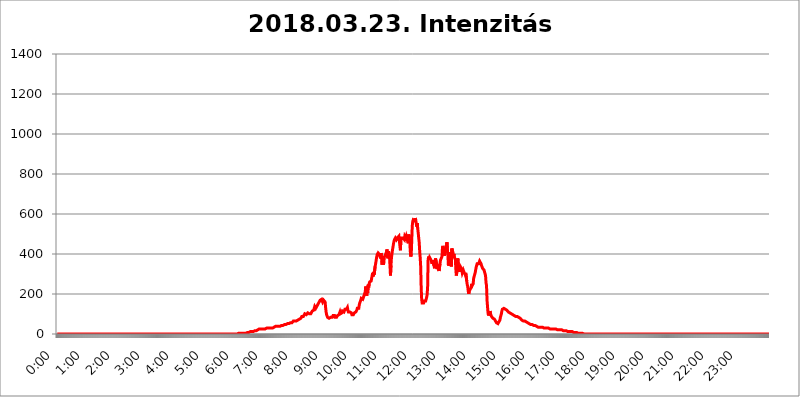
| Category | 2018.03.23. Intenzitás [W/m^2] |
|---|---|
| 0.0 | 0 |
| 0.0006944444444444445 | 0 |
| 0.001388888888888889 | 0 |
| 0.0020833333333333333 | 0 |
| 0.002777777777777778 | 0 |
| 0.003472222222222222 | 0 |
| 0.004166666666666667 | 0 |
| 0.004861111111111111 | 0 |
| 0.005555555555555556 | 0 |
| 0.0062499999999999995 | 0 |
| 0.006944444444444444 | 0 |
| 0.007638888888888889 | 0 |
| 0.008333333333333333 | 0 |
| 0.009027777777777779 | 0 |
| 0.009722222222222222 | 0 |
| 0.010416666666666666 | 0 |
| 0.011111111111111112 | 0 |
| 0.011805555555555555 | 0 |
| 0.012499999999999999 | 0 |
| 0.013194444444444444 | 0 |
| 0.013888888888888888 | 0 |
| 0.014583333333333332 | 0 |
| 0.015277777777777777 | 0 |
| 0.015972222222222224 | 0 |
| 0.016666666666666666 | 0 |
| 0.017361111111111112 | 0 |
| 0.018055555555555557 | 0 |
| 0.01875 | 0 |
| 0.019444444444444445 | 0 |
| 0.02013888888888889 | 0 |
| 0.020833333333333332 | 0 |
| 0.02152777777777778 | 0 |
| 0.022222222222222223 | 0 |
| 0.02291666666666667 | 0 |
| 0.02361111111111111 | 0 |
| 0.024305555555555556 | 0 |
| 0.024999999999999998 | 0 |
| 0.025694444444444447 | 0 |
| 0.02638888888888889 | 0 |
| 0.027083333333333334 | 0 |
| 0.027777777777777776 | 0 |
| 0.02847222222222222 | 0 |
| 0.029166666666666664 | 0 |
| 0.029861111111111113 | 0 |
| 0.030555555555555555 | 0 |
| 0.03125 | 0 |
| 0.03194444444444445 | 0 |
| 0.03263888888888889 | 0 |
| 0.03333333333333333 | 0 |
| 0.034027777777777775 | 0 |
| 0.034722222222222224 | 0 |
| 0.035416666666666666 | 0 |
| 0.036111111111111115 | 0 |
| 0.03680555555555556 | 0 |
| 0.0375 | 0 |
| 0.03819444444444444 | 0 |
| 0.03888888888888889 | 0 |
| 0.03958333333333333 | 0 |
| 0.04027777777777778 | 0 |
| 0.04097222222222222 | 0 |
| 0.041666666666666664 | 0 |
| 0.042361111111111106 | 0 |
| 0.04305555555555556 | 0 |
| 0.043750000000000004 | 0 |
| 0.044444444444444446 | 0 |
| 0.04513888888888889 | 0 |
| 0.04583333333333334 | 0 |
| 0.04652777777777778 | 0 |
| 0.04722222222222222 | 0 |
| 0.04791666666666666 | 0 |
| 0.04861111111111111 | 0 |
| 0.049305555555555554 | 0 |
| 0.049999999999999996 | 0 |
| 0.05069444444444445 | 0 |
| 0.051388888888888894 | 0 |
| 0.052083333333333336 | 0 |
| 0.05277777777777778 | 0 |
| 0.05347222222222222 | 0 |
| 0.05416666666666667 | 0 |
| 0.05486111111111111 | 0 |
| 0.05555555555555555 | 0 |
| 0.05625 | 0 |
| 0.05694444444444444 | 0 |
| 0.057638888888888885 | 0 |
| 0.05833333333333333 | 0 |
| 0.05902777777777778 | 0 |
| 0.059722222222222225 | 0 |
| 0.06041666666666667 | 0 |
| 0.061111111111111116 | 0 |
| 0.06180555555555556 | 0 |
| 0.0625 | 0 |
| 0.06319444444444444 | 0 |
| 0.06388888888888888 | 0 |
| 0.06458333333333334 | 0 |
| 0.06527777777777778 | 0 |
| 0.06597222222222222 | 0 |
| 0.06666666666666667 | 0 |
| 0.06736111111111111 | 0 |
| 0.06805555555555555 | 0 |
| 0.06874999999999999 | 0 |
| 0.06944444444444443 | 0 |
| 0.07013888888888889 | 0 |
| 0.07083333333333333 | 0 |
| 0.07152777777777779 | 0 |
| 0.07222222222222223 | 0 |
| 0.07291666666666667 | 0 |
| 0.07361111111111111 | 0 |
| 0.07430555555555556 | 0 |
| 0.075 | 0 |
| 0.07569444444444444 | 0 |
| 0.0763888888888889 | 0 |
| 0.07708333333333334 | 0 |
| 0.07777777777777778 | 0 |
| 0.07847222222222222 | 0 |
| 0.07916666666666666 | 0 |
| 0.0798611111111111 | 0 |
| 0.08055555555555556 | 0 |
| 0.08125 | 0 |
| 0.08194444444444444 | 0 |
| 0.08263888888888889 | 0 |
| 0.08333333333333333 | 0 |
| 0.08402777777777777 | 0 |
| 0.08472222222222221 | 0 |
| 0.08541666666666665 | 0 |
| 0.08611111111111112 | 0 |
| 0.08680555555555557 | 0 |
| 0.08750000000000001 | 0 |
| 0.08819444444444445 | 0 |
| 0.08888888888888889 | 0 |
| 0.08958333333333333 | 0 |
| 0.09027777777777778 | 0 |
| 0.09097222222222222 | 0 |
| 0.09166666666666667 | 0 |
| 0.09236111111111112 | 0 |
| 0.09305555555555556 | 0 |
| 0.09375 | 0 |
| 0.09444444444444444 | 0 |
| 0.09513888888888888 | 0 |
| 0.09583333333333333 | 0 |
| 0.09652777777777777 | 0 |
| 0.09722222222222222 | 0 |
| 0.09791666666666667 | 0 |
| 0.09861111111111111 | 0 |
| 0.09930555555555555 | 0 |
| 0.09999999999999999 | 0 |
| 0.10069444444444443 | 0 |
| 0.1013888888888889 | 0 |
| 0.10208333333333335 | 0 |
| 0.10277777777777779 | 0 |
| 0.10347222222222223 | 0 |
| 0.10416666666666667 | 0 |
| 0.10486111111111111 | 0 |
| 0.10555555555555556 | 0 |
| 0.10625 | 0 |
| 0.10694444444444444 | 0 |
| 0.1076388888888889 | 0 |
| 0.10833333333333334 | 0 |
| 0.10902777777777778 | 0 |
| 0.10972222222222222 | 0 |
| 0.1111111111111111 | 0 |
| 0.11180555555555556 | 0 |
| 0.11180555555555556 | 0 |
| 0.1125 | 0 |
| 0.11319444444444444 | 0 |
| 0.11388888888888889 | 0 |
| 0.11458333333333333 | 0 |
| 0.11527777777777777 | 0 |
| 0.11597222222222221 | 0 |
| 0.11666666666666665 | 0 |
| 0.1173611111111111 | 0 |
| 0.11805555555555557 | 0 |
| 0.11944444444444445 | 0 |
| 0.12013888888888889 | 0 |
| 0.12083333333333333 | 0 |
| 0.12152777777777778 | 0 |
| 0.12222222222222223 | 0 |
| 0.12291666666666667 | 0 |
| 0.12291666666666667 | 0 |
| 0.12361111111111112 | 0 |
| 0.12430555555555556 | 0 |
| 0.125 | 0 |
| 0.12569444444444444 | 0 |
| 0.12638888888888888 | 0 |
| 0.12708333333333333 | 0 |
| 0.16875 | 0 |
| 0.12847222222222224 | 0 |
| 0.12916666666666668 | 0 |
| 0.12986111111111112 | 0 |
| 0.13055555555555556 | 0 |
| 0.13125 | 0 |
| 0.13194444444444445 | 0 |
| 0.1326388888888889 | 0 |
| 0.13333333333333333 | 0 |
| 0.13402777777777777 | 0 |
| 0.13402777777777777 | 0 |
| 0.13472222222222222 | 0 |
| 0.13541666666666666 | 0 |
| 0.1361111111111111 | 0 |
| 0.13749999999999998 | 0 |
| 0.13819444444444443 | 0 |
| 0.1388888888888889 | 0 |
| 0.13958333333333334 | 0 |
| 0.14027777777777778 | 0 |
| 0.14097222222222222 | 0 |
| 0.14166666666666666 | 0 |
| 0.1423611111111111 | 0 |
| 0.14305555555555557 | 0 |
| 0.14375000000000002 | 0 |
| 0.14444444444444446 | 0 |
| 0.1451388888888889 | 0 |
| 0.1451388888888889 | 0 |
| 0.14652777777777778 | 0 |
| 0.14722222222222223 | 0 |
| 0.14791666666666667 | 0 |
| 0.1486111111111111 | 0 |
| 0.14930555555555555 | 0 |
| 0.15 | 0 |
| 0.15069444444444444 | 0 |
| 0.15138888888888888 | 0 |
| 0.15208333333333332 | 0 |
| 0.15277777777777776 | 0 |
| 0.15347222222222223 | 0 |
| 0.15416666666666667 | 0 |
| 0.15486111111111112 | 0 |
| 0.15555555555555556 | 0 |
| 0.15625 | 0 |
| 0.15694444444444444 | 0 |
| 0.15763888888888888 | 0 |
| 0.15833333333333333 | 0 |
| 0.15902777777777777 | 0 |
| 0.15972222222222224 | 0 |
| 0.16041666666666668 | 0 |
| 0.16111111111111112 | 0 |
| 0.16180555555555556 | 0 |
| 0.1625 | 0 |
| 0.16319444444444445 | 0 |
| 0.1638888888888889 | 0 |
| 0.16458333333333333 | 0 |
| 0.16527777777777777 | 0 |
| 0.16597222222222222 | 0 |
| 0.16666666666666666 | 0 |
| 0.1673611111111111 | 0 |
| 0.16805555555555554 | 0 |
| 0.16874999999999998 | 0 |
| 0.16944444444444443 | 0 |
| 0.17013888888888887 | 0 |
| 0.1708333333333333 | 0 |
| 0.17152777777777775 | 0 |
| 0.17222222222222225 | 0 |
| 0.1729166666666667 | 0 |
| 0.17361111111111113 | 0 |
| 0.17430555555555557 | 0 |
| 0.17500000000000002 | 0 |
| 0.17569444444444446 | 0 |
| 0.1763888888888889 | 0 |
| 0.17708333333333334 | 0 |
| 0.17777777777777778 | 0 |
| 0.17847222222222223 | 0 |
| 0.17916666666666667 | 0 |
| 0.1798611111111111 | 0 |
| 0.18055555555555555 | 0 |
| 0.18125 | 0 |
| 0.18194444444444444 | 0 |
| 0.1826388888888889 | 0 |
| 0.18333333333333335 | 0 |
| 0.1840277777777778 | 0 |
| 0.18472222222222223 | 0 |
| 0.18541666666666667 | 0 |
| 0.18611111111111112 | 0 |
| 0.18680555555555556 | 0 |
| 0.1875 | 0 |
| 0.18819444444444444 | 0 |
| 0.18888888888888888 | 0 |
| 0.18958333333333333 | 0 |
| 0.19027777777777777 | 0 |
| 0.1909722222222222 | 0 |
| 0.19166666666666665 | 0 |
| 0.19236111111111112 | 0 |
| 0.19305555555555554 | 0 |
| 0.19375 | 0 |
| 0.19444444444444445 | 0 |
| 0.1951388888888889 | 0 |
| 0.19583333333333333 | 0 |
| 0.19652777777777777 | 0 |
| 0.19722222222222222 | 0 |
| 0.19791666666666666 | 0 |
| 0.1986111111111111 | 0 |
| 0.19930555555555554 | 0 |
| 0.19999999999999998 | 0 |
| 0.20069444444444443 | 0 |
| 0.20138888888888887 | 0 |
| 0.2020833333333333 | 0 |
| 0.2027777777777778 | 0 |
| 0.2034722222222222 | 0 |
| 0.2041666666666667 | 0 |
| 0.20486111111111113 | 0 |
| 0.20555555555555557 | 0 |
| 0.20625000000000002 | 0 |
| 0.20694444444444446 | 0 |
| 0.2076388888888889 | 0 |
| 0.20833333333333334 | 0 |
| 0.20902777777777778 | 0 |
| 0.20972222222222223 | 0 |
| 0.21041666666666667 | 0 |
| 0.2111111111111111 | 0 |
| 0.21180555555555555 | 0 |
| 0.2125 | 0 |
| 0.21319444444444444 | 0 |
| 0.2138888888888889 | 0 |
| 0.21458333333333335 | 0 |
| 0.2152777777777778 | 0 |
| 0.21597222222222223 | 0 |
| 0.21666666666666667 | 0 |
| 0.21736111111111112 | 0 |
| 0.21805555555555556 | 0 |
| 0.21875 | 0 |
| 0.21944444444444444 | 0 |
| 0.22013888888888888 | 0 |
| 0.22083333333333333 | 0 |
| 0.22152777777777777 | 0 |
| 0.2222222222222222 | 0 |
| 0.22291666666666665 | 0 |
| 0.2236111111111111 | 0 |
| 0.22430555555555556 | 0 |
| 0.225 | 0 |
| 0.22569444444444445 | 0 |
| 0.2263888888888889 | 0 |
| 0.22708333333333333 | 0 |
| 0.22777777777777777 | 0 |
| 0.22847222222222222 | 0 |
| 0.22916666666666666 | 0 |
| 0.2298611111111111 | 0 |
| 0.23055555555555554 | 0 |
| 0.23124999999999998 | 0 |
| 0.23194444444444443 | 0 |
| 0.23263888888888887 | 0 |
| 0.2333333333333333 | 0 |
| 0.2340277777777778 | 0 |
| 0.2347222222222222 | 0 |
| 0.2354166666666667 | 0 |
| 0.23611111111111113 | 0 |
| 0.23680555555555557 | 0 |
| 0.23750000000000002 | 0 |
| 0.23819444444444446 | 0 |
| 0.2388888888888889 | 0 |
| 0.23958333333333334 | 0 |
| 0.24027777777777778 | 0 |
| 0.24097222222222223 | 0 |
| 0.24166666666666667 | 0 |
| 0.2423611111111111 | 0 |
| 0.24305555555555555 | 0 |
| 0.24375 | 0 |
| 0.24444444444444446 | 0 |
| 0.24513888888888888 | 0 |
| 0.24583333333333335 | 0 |
| 0.2465277777777778 | 0 |
| 0.24722222222222223 | 0 |
| 0.24791666666666667 | 0 |
| 0.24861111111111112 | 0 |
| 0.24930555555555556 | 0 |
| 0.25 | 0 |
| 0.25069444444444444 | 0 |
| 0.2513888888888889 | 0 |
| 0.2520833333333333 | 0 |
| 0.25277777777777777 | 0 |
| 0.2534722222222222 | 3.525 |
| 0.25416666666666665 | 3.525 |
| 0.2548611111111111 | 3.525 |
| 0.2555555555555556 | 3.525 |
| 0.25625000000000003 | 3.525 |
| 0.2569444444444445 | 3.525 |
| 0.2576388888888889 | 3.525 |
| 0.25833333333333336 | 3.525 |
| 0.2590277777777778 | 3.525 |
| 0.25972222222222224 | 3.525 |
| 0.2604166666666667 | 3.525 |
| 0.2611111111111111 | 3.525 |
| 0.26180555555555557 | 3.525 |
| 0.2625 | 3.525 |
| 0.26319444444444445 | 3.525 |
| 0.2638888888888889 | 3.525 |
| 0.26458333333333334 | 3.525 |
| 0.2652777777777778 | 3.525 |
| 0.2659722222222222 | 3.525 |
| 0.26666666666666666 | 7.887 |
| 0.2673611111111111 | 7.887 |
| 0.26805555555555555 | 7.887 |
| 0.26875 | 7.887 |
| 0.26944444444444443 | 7.887 |
| 0.2701388888888889 | 7.887 |
| 0.2708333333333333 | 12.257 |
| 0.27152777777777776 | 7.887 |
| 0.2722222222222222 | 12.257 |
| 0.27291666666666664 | 12.257 |
| 0.2736111111111111 | 12.257 |
| 0.2743055555555555 | 12.257 |
| 0.27499999999999997 | 12.257 |
| 0.27569444444444446 | 12.257 |
| 0.27638888888888885 | 12.257 |
| 0.27708333333333335 | 16.636 |
| 0.2777777777777778 | 16.636 |
| 0.27847222222222223 | 16.636 |
| 0.2791666666666667 | 16.636 |
| 0.2798611111111111 | 16.636 |
| 0.28055555555555556 | 21.024 |
| 0.28125 | 21.024 |
| 0.28194444444444444 | 21.024 |
| 0.2826388888888889 | 21.024 |
| 0.2833333333333333 | 25.419 |
| 0.28402777777777777 | 25.419 |
| 0.2847222222222222 | 25.419 |
| 0.28541666666666665 | 25.419 |
| 0.28611111111111115 | 25.419 |
| 0.28680555555555554 | 25.419 |
| 0.28750000000000003 | 25.419 |
| 0.2881944444444445 | 25.419 |
| 0.2888888888888889 | 25.419 |
| 0.28958333333333336 | 25.419 |
| 0.2902777777777778 | 25.419 |
| 0.29097222222222224 | 25.419 |
| 0.2916666666666667 | 25.419 |
| 0.2923611111111111 | 25.419 |
| 0.29305555555555557 | 29.823 |
| 0.29375 | 29.823 |
| 0.29444444444444445 | 29.823 |
| 0.2951388888888889 | 29.823 |
| 0.29583333333333334 | 29.823 |
| 0.2965277777777778 | 29.823 |
| 0.2972222222222222 | 29.823 |
| 0.29791666666666666 | 29.823 |
| 0.2986111111111111 | 29.823 |
| 0.29930555555555555 | 29.823 |
| 0.3 | 29.823 |
| 0.30069444444444443 | 29.823 |
| 0.3013888888888889 | 29.823 |
| 0.3020833333333333 | 29.823 |
| 0.30277777777777776 | 29.823 |
| 0.3034722222222222 | 34.234 |
| 0.30416666666666664 | 34.234 |
| 0.3048611111111111 | 34.234 |
| 0.3055555555555555 | 34.234 |
| 0.30624999999999997 | 38.653 |
| 0.3069444444444444 | 38.653 |
| 0.3076388888888889 | 38.653 |
| 0.30833333333333335 | 38.653 |
| 0.3090277777777778 | 38.653 |
| 0.30972222222222223 | 38.653 |
| 0.3104166666666667 | 38.653 |
| 0.3111111111111111 | 38.653 |
| 0.31180555555555556 | 38.653 |
| 0.3125 | 38.653 |
| 0.31319444444444444 | 38.653 |
| 0.3138888888888889 | 43.079 |
| 0.3145833333333333 | 43.079 |
| 0.31527777777777777 | 43.079 |
| 0.3159722222222222 | 43.079 |
| 0.31666666666666665 | 43.079 |
| 0.31736111111111115 | 43.079 |
| 0.31805555555555554 | 47.511 |
| 0.31875000000000003 | 47.511 |
| 0.3194444444444445 | 47.511 |
| 0.3201388888888889 | 47.511 |
| 0.32083333333333336 | 47.511 |
| 0.3215277777777778 | 47.511 |
| 0.32222222222222224 | 51.951 |
| 0.3229166666666667 | 51.951 |
| 0.3236111111111111 | 51.951 |
| 0.32430555555555557 | 51.951 |
| 0.325 | 51.951 |
| 0.32569444444444445 | 51.951 |
| 0.3263888888888889 | 56.398 |
| 0.32708333333333334 | 56.398 |
| 0.3277777777777778 | 56.398 |
| 0.3284722222222222 | 56.398 |
| 0.32916666666666666 | 56.398 |
| 0.3298611111111111 | 60.85 |
| 0.33055555555555555 | 60.85 |
| 0.33125 | 65.31 |
| 0.33194444444444443 | 65.31 |
| 0.3326388888888889 | 65.31 |
| 0.3333333333333333 | 65.31 |
| 0.3340277777777778 | 69.775 |
| 0.3347222222222222 | 65.31 |
| 0.3354166666666667 | 65.31 |
| 0.3361111111111111 | 65.31 |
| 0.3368055555555556 | 69.775 |
| 0.33749999999999997 | 69.775 |
| 0.33819444444444446 | 69.775 |
| 0.33888888888888885 | 74.246 |
| 0.33958333333333335 | 74.246 |
| 0.34027777777777773 | 74.246 |
| 0.34097222222222223 | 78.722 |
| 0.3416666666666666 | 78.722 |
| 0.3423611111111111 | 83.205 |
| 0.3430555555555555 | 87.692 |
| 0.34375 | 87.692 |
| 0.3444444444444445 | 87.692 |
| 0.3451388888888889 | 87.692 |
| 0.3458333333333334 | 92.184 |
| 0.34652777777777777 | 92.184 |
| 0.34722222222222227 | 101.184 |
| 0.34791666666666665 | 101.184 |
| 0.34861111111111115 | 101.184 |
| 0.34930555555555554 | 96.682 |
| 0.35000000000000003 | 101.184 |
| 0.3506944444444444 | 101.184 |
| 0.3513888888888889 | 105.69 |
| 0.3520833333333333 | 110.201 |
| 0.3527777777777778 | 101.184 |
| 0.3534722222222222 | 101.184 |
| 0.3541666666666667 | 101.184 |
| 0.3548611111111111 | 96.682 |
| 0.35555555555555557 | 101.184 |
| 0.35625 | 101.184 |
| 0.35694444444444445 | 101.184 |
| 0.3576388888888889 | 114.716 |
| 0.35833333333333334 | 114.716 |
| 0.3590277777777778 | 119.235 |
| 0.3597222222222222 | 119.235 |
| 0.36041666666666666 | 128.284 |
| 0.3611111111111111 | 137.347 |
| 0.36180555555555555 | 132.814 |
| 0.3625 | 128.284 |
| 0.36319444444444443 | 132.814 |
| 0.3638888888888889 | 132.814 |
| 0.3645833333333333 | 141.884 |
| 0.3652777777777778 | 141.884 |
| 0.3659722222222222 | 146.423 |
| 0.3666666666666667 | 155.509 |
| 0.3673611111111111 | 160.056 |
| 0.3680555555555556 | 155.509 |
| 0.36874999999999997 | 169.156 |
| 0.36944444444444446 | 164.605 |
| 0.37013888888888885 | 169.156 |
| 0.37083333333333335 | 173.709 |
| 0.37152777777777773 | 169.156 |
| 0.37222222222222223 | 160.056 |
| 0.3729166666666666 | 164.605 |
| 0.3736111111111111 | 169.156 |
| 0.3743055555555555 | 169.156 |
| 0.375 | 164.605 |
| 0.3756944444444445 | 160.056 |
| 0.3763888888888889 | 132.814 |
| 0.3770833333333334 | 110.201 |
| 0.37777777777777777 | 96.682 |
| 0.37847222222222227 | 92.184 |
| 0.37916666666666665 | 83.205 |
| 0.37986111111111115 | 83.205 |
| 0.38055555555555554 | 78.722 |
| 0.38125000000000003 | 78.722 |
| 0.3819444444444444 | 83.205 |
| 0.3826388888888889 | 83.205 |
| 0.3833333333333333 | 83.205 |
| 0.3840277777777778 | 83.205 |
| 0.3847222222222222 | 83.205 |
| 0.3854166666666667 | 83.205 |
| 0.3861111111111111 | 83.205 |
| 0.38680555555555557 | 92.184 |
| 0.3875 | 92.184 |
| 0.38819444444444445 | 92.184 |
| 0.3888888888888889 | 92.184 |
| 0.38958333333333334 | 83.205 |
| 0.3902777777777778 | 83.205 |
| 0.3909722222222222 | 83.205 |
| 0.39166666666666666 | 83.205 |
| 0.3923611111111111 | 87.692 |
| 0.39305555555555555 | 92.184 |
| 0.39375 | 92.184 |
| 0.39444444444444443 | 92.184 |
| 0.3951388888888889 | 96.682 |
| 0.3958333333333333 | 101.184 |
| 0.3965277777777778 | 110.201 |
| 0.3972222222222222 | 101.184 |
| 0.3979166666666667 | 105.69 |
| 0.3986111111111111 | 105.69 |
| 0.3993055555555556 | 105.69 |
| 0.39999999999999997 | 114.716 |
| 0.40069444444444446 | 114.716 |
| 0.40138888888888885 | 114.716 |
| 0.40208333333333335 | 110.201 |
| 0.40277777777777773 | 114.716 |
| 0.40347222222222223 | 123.758 |
| 0.4041666666666666 | 128.284 |
| 0.4048611111111111 | 128.284 |
| 0.4055555555555555 | 123.758 |
| 0.40625 | 123.758 |
| 0.4069444444444445 | 132.814 |
| 0.4076388888888889 | 119.235 |
| 0.4083333333333334 | 110.201 |
| 0.40902777777777777 | 110.201 |
| 0.40972222222222227 | 110.201 |
| 0.41041666666666665 | 110.201 |
| 0.41111111111111115 | 105.69 |
| 0.41180555555555554 | 114.716 |
| 0.41250000000000003 | 105.69 |
| 0.4131944444444444 | 96.682 |
| 0.4138888888888889 | 96.682 |
| 0.4145833333333333 | 101.184 |
| 0.4152777777777778 | 96.682 |
| 0.4159722222222222 | 96.682 |
| 0.4166666666666667 | 105.69 |
| 0.4173611111111111 | 101.184 |
| 0.41805555555555557 | 105.69 |
| 0.41875 | 110.201 |
| 0.41944444444444445 | 114.716 |
| 0.4201388888888889 | 119.235 |
| 0.42083333333333334 | 128.284 |
| 0.4215277777777778 | 123.758 |
| 0.4222222222222222 | 123.758 |
| 0.42291666666666666 | 128.284 |
| 0.4236111111111111 | 146.423 |
| 0.42430555555555555 | 155.509 |
| 0.425 | 150.964 |
| 0.42569444444444443 | 169.156 |
| 0.4263888888888889 | 178.264 |
| 0.4270833333333333 | 173.709 |
| 0.4277777777777778 | 178.264 |
| 0.4284722222222222 | 173.709 |
| 0.4291666666666667 | 169.156 |
| 0.4298611111111111 | 187.378 |
| 0.4305555555555556 | 187.378 |
| 0.43124999999999997 | 191.937 |
| 0.43194444444444446 | 210.182 |
| 0.43263888888888885 | 237.564 |
| 0.43333333333333335 | 237.564 |
| 0.43402777777777773 | 191.937 |
| 0.43472222222222223 | 219.309 |
| 0.4354166666666666 | 205.62 |
| 0.4361111111111111 | 246.689 |
| 0.4368055555555555 | 233 |
| 0.4375 | 251.251 |
| 0.4381944444444445 | 260.373 |
| 0.4388888888888889 | 264.932 |
| 0.4395833333333334 | 260.373 |
| 0.44027777777777777 | 264.932 |
| 0.44097222222222227 | 260.373 |
| 0.44166666666666665 | 269.49 |
| 0.44236111111111115 | 305.898 |
| 0.44305555555555554 | 287.709 |
| 0.44375000000000003 | 310.44 |
| 0.4444444444444444 | 296.808 |
| 0.4451388888888889 | 301.354 |
| 0.4458333333333333 | 337.639 |
| 0.4465277777777778 | 351.198 |
| 0.4472222222222222 | 355.712 |
| 0.4479166666666667 | 382.715 |
| 0.4486111111111111 | 396.164 |
| 0.44930555555555557 | 396.164 |
| 0.45 | 405.108 |
| 0.45069444444444445 | 409.574 |
| 0.4513888888888889 | 405.108 |
| 0.45208333333333334 | 396.164 |
| 0.4527777777777778 | 387.202 |
| 0.4534722222222222 | 378.224 |
| 0.45416666666666666 | 405.108 |
| 0.4548611111111111 | 378.224 |
| 0.45555555555555555 | 346.682 |
| 0.45625 | 373.729 |
| 0.45694444444444443 | 364.728 |
| 0.4576388888888889 | 346.682 |
| 0.4583333333333333 | 382.715 |
| 0.4590277777777778 | 382.715 |
| 0.4597222222222222 | 391.685 |
| 0.4604166666666667 | 387.202 |
| 0.4611111111111111 | 396.164 |
| 0.4618055555555556 | 409.574 |
| 0.46249999999999997 | 422.943 |
| 0.46319444444444446 | 387.202 |
| 0.46388888888888885 | 378.224 |
| 0.46458333333333335 | 414.035 |
| 0.46527777777777773 | 418.492 |
| 0.46597222222222223 | 387.202 |
| 0.4666666666666666 | 342.162 |
| 0.4673611111111111 | 292.259 |
| 0.4680555555555555 | 342.162 |
| 0.46875 | 382.715 |
| 0.4694444444444445 | 400.638 |
| 0.4701388888888889 | 418.492 |
| 0.4708333333333334 | 414.035 |
| 0.47152777777777777 | 449.551 |
| 0.47222222222222227 | 462.786 |
| 0.47291666666666665 | 471.582 |
| 0.47361111111111115 | 475.972 |
| 0.47430555555555554 | 480.356 |
| 0.47500000000000003 | 475.972 |
| 0.4756944444444444 | 471.582 |
| 0.4763888888888889 | 471.582 |
| 0.4770833333333333 | 480.356 |
| 0.4777777777777778 | 484.735 |
| 0.4784722222222222 | 484.735 |
| 0.4791666666666667 | 489.108 |
| 0.4798611111111111 | 489.108 |
| 0.48055555555555557 | 440.702 |
| 0.48125 | 418.492 |
| 0.48194444444444445 | 471.582 |
| 0.4826388888888889 | 480.356 |
| 0.48333333333333334 | 480.356 |
| 0.4840277777777778 | 484.735 |
| 0.4847222222222222 | 480.356 |
| 0.48541666666666666 | 484.735 |
| 0.4861111111111111 | 480.356 |
| 0.48680555555555555 | 471.582 |
| 0.4875 | 489.108 |
| 0.48819444444444443 | 484.735 |
| 0.4888888888888889 | 480.356 |
| 0.4895833333333333 | 489.108 |
| 0.4902777777777778 | 480.356 |
| 0.4909722222222222 | 475.972 |
| 0.4916666666666667 | 462.786 |
| 0.4923611111111111 | 453.968 |
| 0.4930555555555556 | 497.836 |
| 0.49374999999999997 | 480.356 |
| 0.49444444444444446 | 462.786 |
| 0.49513888888888885 | 414.035 |
| 0.49583333333333335 | 387.202 |
| 0.49652777777777773 | 400.638 |
| 0.49722222222222223 | 471.582 |
| 0.4979166666666666 | 541.121 |
| 0.4986111111111111 | 562.53 |
| 0.4993055555555555 | 571.049 |
| 0.5 | 566.793 |
| 0.5006944444444444 | 566.793 |
| 0.5013888888888889 | 566.793 |
| 0.5020833333333333 | 579.542 |
| 0.5027777777777778 | 571.049 |
| 0.5034722222222222 | 553.986 |
| 0.5041666666666667 | 536.82 |
| 0.5048611111111111 | 553.986 |
| 0.5055555555555555 | 528.2 |
| 0.50625 | 506.542 |
| 0.5069444444444444 | 480.356 |
| 0.5076388888888889 | 458.38 |
| 0.5083333333333333 | 414.035 |
| 0.5090277777777777 | 382.715 |
| 0.5097222222222222 | 337.639 |
| 0.5104166666666666 | 233 |
| 0.5111111111111112 | 173.709 |
| 0.5118055555555555 | 155.509 |
| 0.5125000000000001 | 155.509 |
| 0.5131944444444444 | 155.509 |
| 0.513888888888889 | 155.509 |
| 0.5145833333333333 | 164.605 |
| 0.5152777777777778 | 160.056 |
| 0.5159722222222222 | 164.605 |
| 0.5166666666666667 | 164.605 |
| 0.517361111111111 | 173.709 |
| 0.5180555555555556 | 182.82 |
| 0.5187499999999999 | 196.497 |
| 0.5194444444444445 | 233 |
| 0.5201388888888888 | 369.23 |
| 0.5208333333333334 | 387.202 |
| 0.5215277777777778 | 373.729 |
| 0.5222222222222223 | 382.715 |
| 0.5229166666666667 | 378.224 |
| 0.5236111111111111 | 378.224 |
| 0.5243055555555556 | 369.23 |
| 0.525 | 369.23 |
| 0.5256944444444445 | 351.198 |
| 0.5263888888888889 | 369.23 |
| 0.5270833333333333 | 373.729 |
| 0.5277777777777778 | 364.728 |
| 0.5284722222222222 | 342.162 |
| 0.5291666666666667 | 328.584 |
| 0.5298611111111111 | 355.712 |
| 0.5305555555555556 | 378.224 |
| 0.53125 | 378.224 |
| 0.5319444444444444 | 351.198 |
| 0.5326388888888889 | 324.052 |
| 0.5333333333333333 | 333.113 |
| 0.5340277777777778 | 346.682 |
| 0.5347222222222222 | 346.682 |
| 0.5354166666666667 | 314.98 |
| 0.5361111111111111 | 319.517 |
| 0.5368055555555555 | 351.198 |
| 0.5375 | 369.23 |
| 0.5381944444444444 | 373.729 |
| 0.5388888888888889 | 369.23 |
| 0.5395833333333333 | 387.202 |
| 0.5402777777777777 | 431.833 |
| 0.5409722222222222 | 440.702 |
| 0.5416666666666666 | 436.27 |
| 0.5423611111111112 | 418.492 |
| 0.5430555555555555 | 391.685 |
| 0.5437500000000001 | 396.164 |
| 0.5444444444444444 | 427.39 |
| 0.545138888888889 | 414.035 |
| 0.5458333333333333 | 409.574 |
| 0.5465277777777778 | 458.38 |
| 0.5472222222222222 | 418.492 |
| 0.5479166666666667 | 391.685 |
| 0.548611111111111 | 342.162 |
| 0.5493055555555556 | 405.108 |
| 0.5499999999999999 | 355.712 |
| 0.5506944444444445 | 342.162 |
| 0.5513888888888888 | 409.574 |
| 0.5520833333333334 | 378.224 |
| 0.5527777777777778 | 337.639 |
| 0.5534722222222223 | 427.39 |
| 0.5541666666666667 | 418.492 |
| 0.5548611111111111 | 409.574 |
| 0.5555555555555556 | 387.202 |
| 0.55625 | 400.638 |
| 0.5569444444444445 | 382.715 |
| 0.5576388888888889 | 378.224 |
| 0.5583333333333333 | 373.729 |
| 0.5590277777777778 | 324.052 |
| 0.5597222222222222 | 292.259 |
| 0.5604166666666667 | 310.44 |
| 0.5611111111111111 | 360.221 |
| 0.5618055555555556 | 378.224 |
| 0.5625 | 346.682 |
| 0.5631944444444444 | 324.052 |
| 0.5638888888888889 | 310.44 |
| 0.5645833333333333 | 328.584 |
| 0.5652777777777778 | 337.639 |
| 0.5659722222222222 | 333.113 |
| 0.5666666666666667 | 328.584 |
| 0.5673611111111111 | 319.517 |
| 0.5680555555555555 | 305.898 |
| 0.56875 | 305.898 |
| 0.5694444444444444 | 319.517 |
| 0.5701388888888889 | 314.98 |
| 0.5708333333333333 | 305.898 |
| 0.5715277777777777 | 305.898 |
| 0.5722222222222222 | 296.808 |
| 0.5729166666666666 | 305.898 |
| 0.5736111111111112 | 301.354 |
| 0.5743055555555555 | 264.932 |
| 0.5750000000000001 | 246.689 |
| 0.5756944444444444 | 237.564 |
| 0.576388888888889 | 214.746 |
| 0.5770833333333333 | 201.058 |
| 0.5777777777777778 | 210.182 |
| 0.5784722222222222 | 219.309 |
| 0.5791666666666667 | 219.309 |
| 0.579861111111111 | 214.746 |
| 0.5805555555555556 | 233 |
| 0.5812499999999999 | 251.251 |
| 0.5819444444444445 | 242.127 |
| 0.5826388888888888 | 242.127 |
| 0.5833333333333334 | 251.251 |
| 0.5840277777777778 | 278.603 |
| 0.5847222222222223 | 287.709 |
| 0.5854166666666667 | 292.259 |
| 0.5861111111111111 | 305.898 |
| 0.5868055555555556 | 305.898 |
| 0.5875 | 333.113 |
| 0.5881944444444445 | 333.113 |
| 0.5888888888888889 | 351.198 |
| 0.5895833333333333 | 355.712 |
| 0.5902777777777778 | 346.682 |
| 0.5909722222222222 | 351.198 |
| 0.5916666666666667 | 355.712 |
| 0.5923611111111111 | 364.728 |
| 0.5930555555555556 | 360.221 |
| 0.59375 | 360.221 |
| 0.5944444444444444 | 351.198 |
| 0.5951388888888889 | 342.162 |
| 0.5958333333333333 | 337.639 |
| 0.5965277777777778 | 328.584 |
| 0.5972222222222222 | 328.584 |
| 0.5979166666666667 | 328.584 |
| 0.5986111111111111 | 319.517 |
| 0.5993055555555555 | 324.052 |
| 0.6 | 314.98 |
| 0.6006944444444444 | 292.259 |
| 0.6013888888888889 | 255.813 |
| 0.6020833333333333 | 242.127 |
| 0.6027777777777777 | 169.156 |
| 0.6034722222222222 | 137.347 |
| 0.6041666666666666 | 105.69 |
| 0.6048611111111112 | 92.184 |
| 0.6055555555555555 | 92.184 |
| 0.6062500000000001 | 96.682 |
| 0.6069444444444444 | 114.716 |
| 0.607638888888889 | 101.184 |
| 0.6083333333333333 | 101.184 |
| 0.6090277777777778 | 87.692 |
| 0.6097222222222222 | 87.692 |
| 0.6104166666666667 | 83.205 |
| 0.611111111111111 | 78.722 |
| 0.6118055555555556 | 74.246 |
| 0.6124999999999999 | 74.246 |
| 0.6131944444444445 | 74.246 |
| 0.6138888888888888 | 69.775 |
| 0.6145833333333334 | 65.31 |
| 0.6152777777777778 | 60.85 |
| 0.6159722222222223 | 56.398 |
| 0.6166666666666667 | 56.398 |
| 0.6173611111111111 | 51.951 |
| 0.6180555555555556 | 51.951 |
| 0.61875 | 56.398 |
| 0.6194444444444445 | 60.85 |
| 0.6201388888888889 | 65.31 |
| 0.6208333333333333 | 69.775 |
| 0.6215277777777778 | 83.205 |
| 0.6222222222222222 | 92.184 |
| 0.6229166666666667 | 101.184 |
| 0.6236111111111111 | 114.716 |
| 0.6243055555555556 | 123.758 |
| 0.625 | 128.284 |
| 0.6256944444444444 | 128.284 |
| 0.6263888888888889 | 128.284 |
| 0.6270833333333333 | 128.284 |
| 0.6277777777777778 | 123.758 |
| 0.6284722222222222 | 123.758 |
| 0.6291666666666667 | 119.235 |
| 0.6298611111111111 | 119.235 |
| 0.6305555555555555 | 119.235 |
| 0.63125 | 119.235 |
| 0.6319444444444444 | 114.716 |
| 0.6326388888888889 | 110.201 |
| 0.6333333333333333 | 110.201 |
| 0.6340277777777777 | 105.69 |
| 0.6347222222222222 | 105.69 |
| 0.6354166666666666 | 105.69 |
| 0.6361111111111112 | 101.184 |
| 0.6368055555555555 | 101.184 |
| 0.6375000000000001 | 96.682 |
| 0.6381944444444444 | 96.682 |
| 0.638888888888889 | 96.682 |
| 0.6395833333333333 | 96.682 |
| 0.6402777777777778 | 96.682 |
| 0.6409722222222222 | 92.184 |
| 0.6416666666666667 | 92.184 |
| 0.642361111111111 | 92.184 |
| 0.6430555555555556 | 87.692 |
| 0.6437499999999999 | 87.692 |
| 0.6444444444444445 | 87.692 |
| 0.6451388888888888 | 87.692 |
| 0.6458333333333334 | 83.205 |
| 0.6465277777777778 | 83.205 |
| 0.6472222222222223 | 83.205 |
| 0.6479166666666667 | 78.722 |
| 0.6486111111111111 | 78.722 |
| 0.6493055555555556 | 78.722 |
| 0.65 | 74.246 |
| 0.6506944444444445 | 74.246 |
| 0.6513888888888889 | 69.775 |
| 0.6520833333333333 | 69.775 |
| 0.6527777777777778 | 65.31 |
| 0.6534722222222222 | 65.31 |
| 0.6541666666666667 | 65.31 |
| 0.6548611111111111 | 65.31 |
| 0.6555555555555556 | 65.31 |
| 0.65625 | 60.85 |
| 0.6569444444444444 | 60.85 |
| 0.6576388888888889 | 60.85 |
| 0.6583333333333333 | 56.398 |
| 0.6590277777777778 | 56.398 |
| 0.6597222222222222 | 56.398 |
| 0.6604166666666667 | 56.398 |
| 0.6611111111111111 | 51.951 |
| 0.6618055555555555 | 51.951 |
| 0.6625 | 51.951 |
| 0.6631944444444444 | 51.951 |
| 0.6638888888888889 | 47.511 |
| 0.6645833333333333 | 47.511 |
| 0.6652777777777777 | 47.511 |
| 0.6659722222222222 | 47.511 |
| 0.6666666666666666 | 47.511 |
| 0.6673611111111111 | 47.511 |
| 0.6680555555555556 | 43.079 |
| 0.6687500000000001 | 43.079 |
| 0.6694444444444444 | 43.079 |
| 0.6701388888888888 | 43.079 |
| 0.6708333333333334 | 38.653 |
| 0.6715277777777778 | 38.653 |
| 0.6722222222222222 | 38.653 |
| 0.6729166666666666 | 38.653 |
| 0.6736111111111112 | 34.234 |
| 0.6743055555555556 | 34.234 |
| 0.6749999999999999 | 34.234 |
| 0.6756944444444444 | 34.234 |
| 0.6763888888888889 | 34.234 |
| 0.6770833333333334 | 34.234 |
| 0.6777777777777777 | 34.234 |
| 0.6784722222222223 | 34.234 |
| 0.6791666666666667 | 34.234 |
| 0.6798611111111111 | 34.234 |
| 0.6805555555555555 | 34.234 |
| 0.68125 | 29.823 |
| 0.6819444444444445 | 29.823 |
| 0.6826388888888889 | 29.823 |
| 0.6833333333333332 | 29.823 |
| 0.6840277777777778 | 29.823 |
| 0.6847222222222222 | 29.823 |
| 0.6854166666666667 | 29.823 |
| 0.686111111111111 | 29.823 |
| 0.6868055555555556 | 29.823 |
| 0.6875 | 29.823 |
| 0.6881944444444444 | 29.823 |
| 0.688888888888889 | 29.823 |
| 0.6895833333333333 | 25.419 |
| 0.6902777777777778 | 25.419 |
| 0.6909722222222222 | 25.419 |
| 0.6916666666666668 | 25.419 |
| 0.6923611111111111 | 25.419 |
| 0.6930555555555555 | 25.419 |
| 0.69375 | 25.419 |
| 0.6944444444444445 | 25.419 |
| 0.6951388888888889 | 25.419 |
| 0.6958333333333333 | 25.419 |
| 0.6965277777777777 | 25.419 |
| 0.6972222222222223 | 25.419 |
| 0.6979166666666666 | 25.419 |
| 0.6986111111111111 | 25.419 |
| 0.6993055555555556 | 25.419 |
| 0.7000000000000001 | 25.419 |
| 0.7006944444444444 | 25.419 |
| 0.7013888888888888 | 21.024 |
| 0.7020833333333334 | 21.024 |
| 0.7027777777777778 | 21.024 |
| 0.7034722222222222 | 21.024 |
| 0.7041666666666666 | 21.024 |
| 0.7048611111111112 | 21.024 |
| 0.7055555555555556 | 21.024 |
| 0.7062499999999999 | 21.024 |
| 0.7069444444444444 | 21.024 |
| 0.7076388888888889 | 21.024 |
| 0.7083333333333334 | 16.636 |
| 0.7090277777777777 | 16.636 |
| 0.7097222222222223 | 16.636 |
| 0.7104166666666667 | 16.636 |
| 0.7111111111111111 | 16.636 |
| 0.7118055555555555 | 16.636 |
| 0.7125 | 16.636 |
| 0.7131944444444445 | 16.636 |
| 0.7138888888888889 | 16.636 |
| 0.7145833333333332 | 12.257 |
| 0.7152777777777778 | 12.257 |
| 0.7159722222222222 | 12.257 |
| 0.7166666666666667 | 12.257 |
| 0.717361111111111 | 12.257 |
| 0.7180555555555556 | 12.257 |
| 0.71875 | 12.257 |
| 0.7194444444444444 | 12.257 |
| 0.720138888888889 | 12.257 |
| 0.7208333333333333 | 12.257 |
| 0.7215277777777778 | 12.257 |
| 0.7222222222222222 | 12.257 |
| 0.7229166666666668 | 7.887 |
| 0.7236111111111111 | 7.887 |
| 0.7243055555555555 | 7.887 |
| 0.725 | 7.887 |
| 0.7256944444444445 | 7.887 |
| 0.7263888888888889 | 7.887 |
| 0.7270833333333333 | 7.887 |
| 0.7277777777777777 | 7.887 |
| 0.7284722222222223 | 7.887 |
| 0.7291666666666666 | 7.887 |
| 0.7298611111111111 | 7.887 |
| 0.7305555555555556 | 3.525 |
| 0.7312500000000001 | 7.887 |
| 0.7319444444444444 | 3.525 |
| 0.7326388888888888 | 3.525 |
| 0.7333333333333334 | 3.525 |
| 0.7340277777777778 | 3.525 |
| 0.7347222222222222 | 3.525 |
| 0.7354166666666666 | 3.525 |
| 0.7361111111111112 | 3.525 |
| 0.7368055555555556 | 3.525 |
| 0.7374999999999999 | 3.525 |
| 0.7381944444444444 | 3.525 |
| 0.7388888888888889 | 0 |
| 0.7395833333333334 | 0 |
| 0.7402777777777777 | 0 |
| 0.7409722222222223 | 0 |
| 0.7416666666666667 | 0 |
| 0.7423611111111111 | 0 |
| 0.7430555555555555 | 0 |
| 0.74375 | 0 |
| 0.7444444444444445 | 0 |
| 0.7451388888888889 | 0 |
| 0.7458333333333332 | 0 |
| 0.7465277777777778 | 0 |
| 0.7472222222222222 | 0 |
| 0.7479166666666667 | 0 |
| 0.748611111111111 | 0 |
| 0.7493055555555556 | 0 |
| 0.75 | 0 |
| 0.7506944444444444 | 0 |
| 0.751388888888889 | 0 |
| 0.7520833333333333 | 0 |
| 0.7527777777777778 | 0 |
| 0.7534722222222222 | 0 |
| 0.7541666666666668 | 0 |
| 0.7548611111111111 | 0 |
| 0.7555555555555555 | 0 |
| 0.75625 | 0 |
| 0.7569444444444445 | 0 |
| 0.7576388888888889 | 0 |
| 0.7583333333333333 | 0 |
| 0.7590277777777777 | 0 |
| 0.7597222222222223 | 0 |
| 0.7604166666666666 | 0 |
| 0.7611111111111111 | 0 |
| 0.7618055555555556 | 0 |
| 0.7625000000000001 | 0 |
| 0.7631944444444444 | 0 |
| 0.7638888888888888 | 0 |
| 0.7645833333333334 | 0 |
| 0.7652777777777778 | 0 |
| 0.7659722222222222 | 0 |
| 0.7666666666666666 | 0 |
| 0.7673611111111112 | 0 |
| 0.7680555555555556 | 0 |
| 0.7687499999999999 | 0 |
| 0.7694444444444444 | 0 |
| 0.7701388888888889 | 0 |
| 0.7708333333333334 | 0 |
| 0.7715277777777777 | 0 |
| 0.7722222222222223 | 0 |
| 0.7729166666666667 | 0 |
| 0.7736111111111111 | 0 |
| 0.7743055555555555 | 0 |
| 0.775 | 0 |
| 0.7756944444444445 | 0 |
| 0.7763888888888889 | 0 |
| 0.7770833333333332 | 0 |
| 0.7777777777777778 | 0 |
| 0.7784722222222222 | 0 |
| 0.7791666666666667 | 0 |
| 0.779861111111111 | 0 |
| 0.7805555555555556 | 0 |
| 0.78125 | 0 |
| 0.7819444444444444 | 0 |
| 0.782638888888889 | 0 |
| 0.7833333333333333 | 0 |
| 0.7840277777777778 | 0 |
| 0.7847222222222222 | 0 |
| 0.7854166666666668 | 0 |
| 0.7861111111111111 | 0 |
| 0.7868055555555555 | 0 |
| 0.7875 | 0 |
| 0.7881944444444445 | 0 |
| 0.7888888888888889 | 0 |
| 0.7895833333333333 | 0 |
| 0.7902777777777777 | 0 |
| 0.7909722222222223 | 0 |
| 0.7916666666666666 | 0 |
| 0.7923611111111111 | 0 |
| 0.7930555555555556 | 0 |
| 0.7937500000000001 | 0 |
| 0.7944444444444444 | 0 |
| 0.7951388888888888 | 0 |
| 0.7958333333333334 | 0 |
| 0.7965277777777778 | 0 |
| 0.7972222222222222 | 0 |
| 0.7979166666666666 | 0 |
| 0.7986111111111112 | 0 |
| 0.7993055555555556 | 0 |
| 0.7999999999999999 | 0 |
| 0.8006944444444444 | 0 |
| 0.8013888888888889 | 0 |
| 0.8020833333333334 | 0 |
| 0.8027777777777777 | 0 |
| 0.8034722222222223 | 0 |
| 0.8041666666666667 | 0 |
| 0.8048611111111111 | 0 |
| 0.8055555555555555 | 0 |
| 0.80625 | 0 |
| 0.8069444444444445 | 0 |
| 0.8076388888888889 | 0 |
| 0.8083333333333332 | 0 |
| 0.8090277777777778 | 0 |
| 0.8097222222222222 | 0 |
| 0.8104166666666667 | 0 |
| 0.811111111111111 | 0 |
| 0.8118055555555556 | 0 |
| 0.8125 | 0 |
| 0.8131944444444444 | 0 |
| 0.813888888888889 | 0 |
| 0.8145833333333333 | 0 |
| 0.8152777777777778 | 0 |
| 0.8159722222222222 | 0 |
| 0.8166666666666668 | 0 |
| 0.8173611111111111 | 0 |
| 0.8180555555555555 | 0 |
| 0.81875 | 0 |
| 0.8194444444444445 | 0 |
| 0.8201388888888889 | 0 |
| 0.8208333333333333 | 0 |
| 0.8215277777777777 | 0 |
| 0.8222222222222223 | 0 |
| 0.8229166666666666 | 0 |
| 0.8236111111111111 | 0 |
| 0.8243055555555556 | 0 |
| 0.8250000000000001 | 0 |
| 0.8256944444444444 | 0 |
| 0.8263888888888888 | 0 |
| 0.8270833333333334 | 0 |
| 0.8277777777777778 | 0 |
| 0.8284722222222222 | 0 |
| 0.8291666666666666 | 0 |
| 0.8298611111111112 | 0 |
| 0.8305555555555556 | 0 |
| 0.8312499999999999 | 0 |
| 0.8319444444444444 | 0 |
| 0.8326388888888889 | 0 |
| 0.8333333333333334 | 0 |
| 0.8340277777777777 | 0 |
| 0.8347222222222223 | 0 |
| 0.8354166666666667 | 0 |
| 0.8361111111111111 | 0 |
| 0.8368055555555555 | 0 |
| 0.8375 | 0 |
| 0.8381944444444445 | 0 |
| 0.8388888888888889 | 0 |
| 0.8395833333333332 | 0 |
| 0.8402777777777778 | 0 |
| 0.8409722222222222 | 0 |
| 0.8416666666666667 | 0 |
| 0.842361111111111 | 0 |
| 0.8430555555555556 | 0 |
| 0.84375 | 0 |
| 0.8444444444444444 | 0 |
| 0.845138888888889 | 0 |
| 0.8458333333333333 | 0 |
| 0.8465277777777778 | 0 |
| 0.8472222222222222 | 0 |
| 0.8479166666666668 | 0 |
| 0.8486111111111111 | 0 |
| 0.8493055555555555 | 0 |
| 0.85 | 0 |
| 0.8506944444444445 | 0 |
| 0.8513888888888889 | 0 |
| 0.8520833333333333 | 0 |
| 0.8527777777777777 | 0 |
| 0.8534722222222223 | 0 |
| 0.8541666666666666 | 0 |
| 0.8548611111111111 | 0 |
| 0.8555555555555556 | 0 |
| 0.8562500000000001 | 0 |
| 0.8569444444444444 | 0 |
| 0.8576388888888888 | 0 |
| 0.8583333333333334 | 0 |
| 0.8590277777777778 | 0 |
| 0.8597222222222222 | 0 |
| 0.8604166666666666 | 0 |
| 0.8611111111111112 | 0 |
| 0.8618055555555556 | 0 |
| 0.8624999999999999 | 0 |
| 0.8631944444444444 | 0 |
| 0.8638888888888889 | 0 |
| 0.8645833333333334 | 0 |
| 0.8652777777777777 | 0 |
| 0.8659722222222223 | 0 |
| 0.8666666666666667 | 0 |
| 0.8673611111111111 | 0 |
| 0.8680555555555555 | 0 |
| 0.86875 | 0 |
| 0.8694444444444445 | 0 |
| 0.8701388888888889 | 0 |
| 0.8708333333333332 | 0 |
| 0.8715277777777778 | 0 |
| 0.8722222222222222 | 0 |
| 0.8729166666666667 | 0 |
| 0.873611111111111 | 0 |
| 0.8743055555555556 | 0 |
| 0.875 | 0 |
| 0.8756944444444444 | 0 |
| 0.876388888888889 | 0 |
| 0.8770833333333333 | 0 |
| 0.8777777777777778 | 0 |
| 0.8784722222222222 | 0 |
| 0.8791666666666668 | 0 |
| 0.8798611111111111 | 0 |
| 0.8805555555555555 | 0 |
| 0.88125 | 0 |
| 0.8819444444444445 | 0 |
| 0.8826388888888889 | 0 |
| 0.8833333333333333 | 0 |
| 0.8840277777777777 | 0 |
| 0.8847222222222223 | 0 |
| 0.8854166666666666 | 0 |
| 0.8861111111111111 | 0 |
| 0.8868055555555556 | 0 |
| 0.8875000000000001 | 0 |
| 0.8881944444444444 | 0 |
| 0.8888888888888888 | 0 |
| 0.8895833333333334 | 0 |
| 0.8902777777777778 | 0 |
| 0.8909722222222222 | 0 |
| 0.8916666666666666 | 0 |
| 0.8923611111111112 | 0 |
| 0.8930555555555556 | 0 |
| 0.8937499999999999 | 0 |
| 0.8944444444444444 | 0 |
| 0.8951388888888889 | 0 |
| 0.8958333333333334 | 0 |
| 0.8965277777777777 | 0 |
| 0.8972222222222223 | 0 |
| 0.8979166666666667 | 0 |
| 0.8986111111111111 | 0 |
| 0.8993055555555555 | 0 |
| 0.9 | 0 |
| 0.9006944444444445 | 0 |
| 0.9013888888888889 | 0 |
| 0.9020833333333332 | 0 |
| 0.9027777777777778 | 0 |
| 0.9034722222222222 | 0 |
| 0.9041666666666667 | 0 |
| 0.904861111111111 | 0 |
| 0.9055555555555556 | 0 |
| 0.90625 | 0 |
| 0.9069444444444444 | 0 |
| 0.907638888888889 | 0 |
| 0.9083333333333333 | 0 |
| 0.9090277777777778 | 0 |
| 0.9097222222222222 | 0 |
| 0.9104166666666668 | 0 |
| 0.9111111111111111 | 0 |
| 0.9118055555555555 | 0 |
| 0.9125 | 0 |
| 0.9131944444444445 | 0 |
| 0.9138888888888889 | 0 |
| 0.9145833333333333 | 0 |
| 0.9152777777777777 | 0 |
| 0.9159722222222223 | 0 |
| 0.9166666666666666 | 0 |
| 0.9173611111111111 | 0 |
| 0.9180555555555556 | 0 |
| 0.9187500000000001 | 0 |
| 0.9194444444444444 | 0 |
| 0.9201388888888888 | 0 |
| 0.9208333333333334 | 0 |
| 0.9215277777777778 | 0 |
| 0.9222222222222222 | 0 |
| 0.9229166666666666 | 0 |
| 0.9236111111111112 | 0 |
| 0.9243055555555556 | 0 |
| 0.9249999999999999 | 0 |
| 0.9256944444444444 | 0 |
| 0.9263888888888889 | 0 |
| 0.9270833333333334 | 0 |
| 0.9277777777777777 | 0 |
| 0.9284722222222223 | 0 |
| 0.9291666666666667 | 0 |
| 0.9298611111111111 | 0 |
| 0.9305555555555555 | 0 |
| 0.93125 | 0 |
| 0.9319444444444445 | 0 |
| 0.9326388888888889 | 0 |
| 0.9333333333333332 | 0 |
| 0.9340277777777778 | 0 |
| 0.9347222222222222 | 0 |
| 0.9354166666666667 | 0 |
| 0.936111111111111 | 0 |
| 0.9368055555555556 | 0 |
| 0.9375 | 0 |
| 0.9381944444444444 | 0 |
| 0.938888888888889 | 0 |
| 0.9395833333333333 | 0 |
| 0.9402777777777778 | 0 |
| 0.9409722222222222 | 0 |
| 0.9416666666666668 | 0 |
| 0.9423611111111111 | 0 |
| 0.9430555555555555 | 0 |
| 0.94375 | 0 |
| 0.9444444444444445 | 0 |
| 0.9451388888888889 | 0 |
| 0.9458333333333333 | 0 |
| 0.9465277777777777 | 0 |
| 0.9472222222222223 | 0 |
| 0.9479166666666666 | 0 |
| 0.9486111111111111 | 0 |
| 0.9493055555555556 | 0 |
| 0.9500000000000001 | 0 |
| 0.9506944444444444 | 0 |
| 0.9513888888888888 | 0 |
| 0.9520833333333334 | 0 |
| 0.9527777777777778 | 0 |
| 0.9534722222222222 | 0 |
| 0.9541666666666666 | 0 |
| 0.9548611111111112 | 0 |
| 0.9555555555555556 | 0 |
| 0.9562499999999999 | 0 |
| 0.9569444444444444 | 0 |
| 0.9576388888888889 | 0 |
| 0.9583333333333334 | 0 |
| 0.9590277777777777 | 0 |
| 0.9597222222222223 | 0 |
| 0.9604166666666667 | 0 |
| 0.9611111111111111 | 0 |
| 0.9618055555555555 | 0 |
| 0.9625 | 0 |
| 0.9631944444444445 | 0 |
| 0.9638888888888889 | 0 |
| 0.9645833333333332 | 0 |
| 0.9652777777777778 | 0 |
| 0.9659722222222222 | 0 |
| 0.9666666666666667 | 0 |
| 0.967361111111111 | 0 |
| 0.9680555555555556 | 0 |
| 0.96875 | 0 |
| 0.9694444444444444 | 0 |
| 0.970138888888889 | 0 |
| 0.9708333333333333 | 0 |
| 0.9715277777777778 | 0 |
| 0.9722222222222222 | 0 |
| 0.9729166666666668 | 0 |
| 0.9736111111111111 | 0 |
| 0.9743055555555555 | 0 |
| 0.975 | 0 |
| 0.9756944444444445 | 0 |
| 0.9763888888888889 | 0 |
| 0.9770833333333333 | 0 |
| 0.9777777777777777 | 0 |
| 0.9784722222222223 | 0 |
| 0.9791666666666666 | 0 |
| 0.9798611111111111 | 0 |
| 0.9805555555555556 | 0 |
| 0.9812500000000001 | 0 |
| 0.9819444444444444 | 0 |
| 0.9826388888888888 | 0 |
| 0.9833333333333334 | 0 |
| 0.9840277777777778 | 0 |
| 0.9847222222222222 | 0 |
| 0.9854166666666666 | 0 |
| 0.9861111111111112 | 0 |
| 0.9868055555555556 | 0 |
| 0.9874999999999999 | 0 |
| 0.9881944444444444 | 0 |
| 0.9888888888888889 | 0 |
| 0.9895833333333334 | 0 |
| 0.9902777777777777 | 0 |
| 0.9909722222222223 | 0 |
| 0.9916666666666667 | 0 |
| 0.9923611111111111 | 0 |
| 0.9930555555555555 | 0 |
| 0.99375 | 0 |
| 0.9944444444444445 | 0 |
| 0.9951388888888889 | 0 |
| 0.9958333333333332 | 0 |
| 0.9965277777777778 | 0 |
| 0.9972222222222222 | 0 |
| 0.9979166666666667 | 0 |
| 0.998611111111111 | 0 |
| 0.9993055555555556 | 0 |